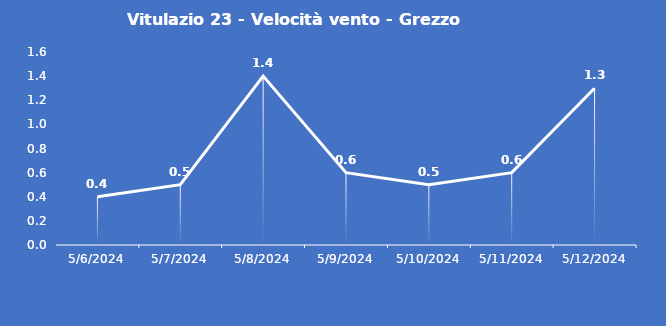
| Category | Vitulazio 23 - Velocità vento - Grezzo (m/s) |
|---|---|
| 5/6/24 | 0.4 |
| 5/7/24 | 0.5 |
| 5/8/24 | 1.4 |
| 5/9/24 | 0.6 |
| 5/10/24 | 0.5 |
| 5/11/24 | 0.6 |
| 5/12/24 | 1.3 |